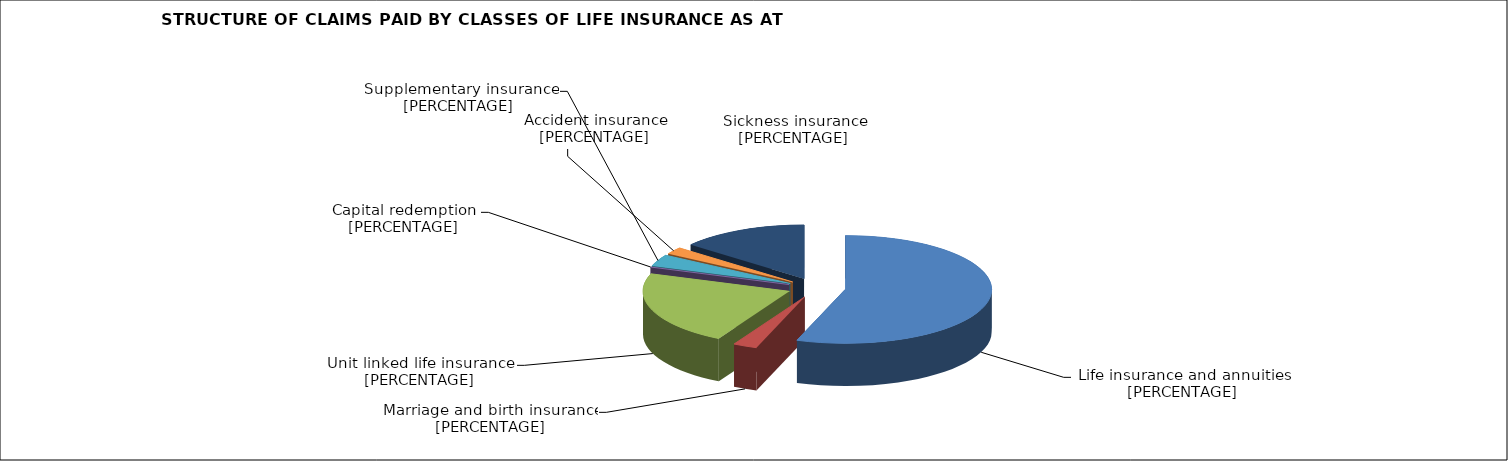
| Category | Life insurance and annuities |
|---|---|
| 0.5534539012066179 | 0.553 |
| 0.02660623153952416 | 0.027 |
| 0.2228046875351831 | 0.223 |
| 0.0 | 0 |
| 0.03511092151274153 | 0.035 |
| 0.021121530757193637 | 0.021 |
| 0.14090272744873972 | 0.141 |